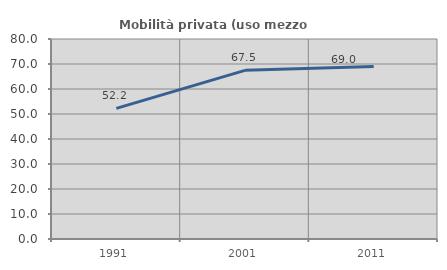
| Category | Mobilità privata (uso mezzo privato) |
|---|---|
| 1991.0 | 52.245 |
| 2001.0 | 67.452 |
| 2011.0 | 69.048 |